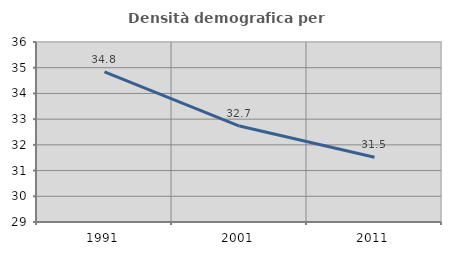
| Category | Densità demografica |
|---|---|
| 1991.0 | 34.841 |
| 2001.0 | 32.732 |
| 2011.0 | 31.521 |